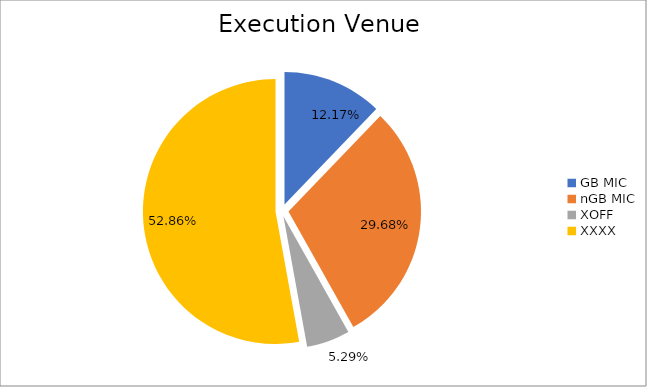
| Category | Series 0 |
|---|---|
| GB MIC | 1152264.699 |
| nGB MIC | 2809914.752 |
| XOFF | 500312.325 |
| XXXX | 5003413.048 |